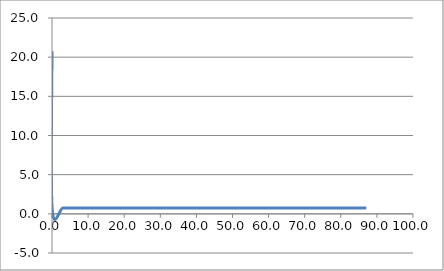
| Category | Elevation (in.) |
|---|---|
| 0.0 | 20.75 |
| 0.024 | 0.75 |
| 3.024 | 0.75 |
| 6.024 | 0.75 |
| 9.024000000000001 | 0.75 |
| 12.024000000000001 | 0.75 |
| 15.024000000000001 | 0.75 |
| 18.024 | 0.75 |
| 21.024 | 0.75 |
| 24.023999999999997 | 0.75 |
| 27.023999999999997 | 0.75 |
| 30.023999999999997 | 0.75 |
| 33.024 | 0.75 |
| 36.024 | 0.75 |
| 39.024 | 0.75 |
| 42.024 | 0.75 |
| 45.024 | 0.75 |
| 48.024 | 0.75 |
| 51.024 | 0.75 |
| 54.024 | 0.75 |
| 57.024 | 0.75 |
| 60.024 | 0.75 |
| 63.024 | 0.75 |
| 66.024 | 0.75 |
| 69.024 | 0.75 |
| 72.024 | 0.75 |
| 75.024 | 0.75 |
| 78.024 | 0.75 |
| 81.024 | 0.75 |
| 84.024 | 0.75 |
| 87.024 | 0.75 |